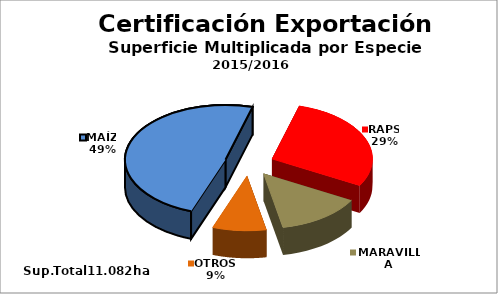
| Category | Series 0 |
|---|---|
| MAÍZ | 5407 |
| RAPS | 3184 |
| MARAVILLA | 1533 |
| OTROS | 958 |